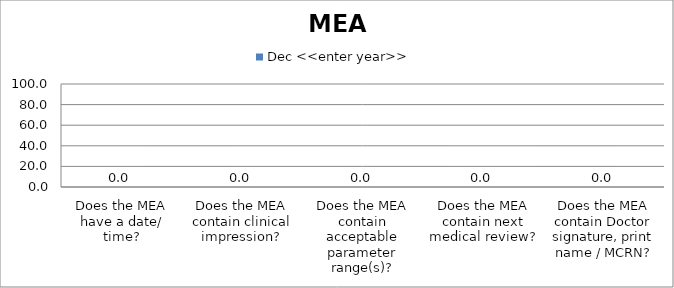
| Category | Dec <<enter year>> |
|---|---|
| Does the MEA have a date/ time? | 0 |
| Does the MEA contain clinical impression? | 0 |
| Does the MEA contain acceptable parameter range(s)? | 0 |
| Does the MEA contain next medical review? | 0 |
| Does the MEA contain Doctor signature, print name / MCRN? | 0 |